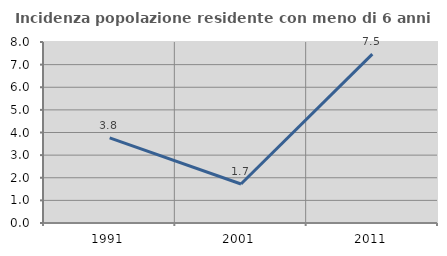
| Category | Incidenza popolazione residente con meno di 6 anni |
|---|---|
| 1991.0 | 3.763 |
| 2001.0 | 1.724 |
| 2011.0 | 7.463 |